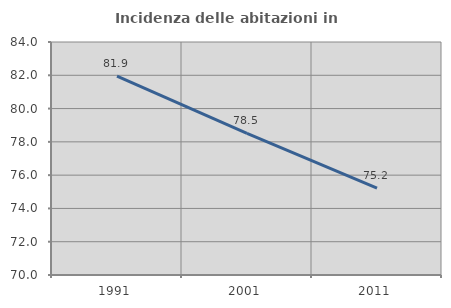
| Category | Incidenza delle abitazioni in proprietà  |
|---|---|
| 1991.0 | 81.947 |
| 2001.0 | 78.516 |
| 2011.0 | 75.225 |